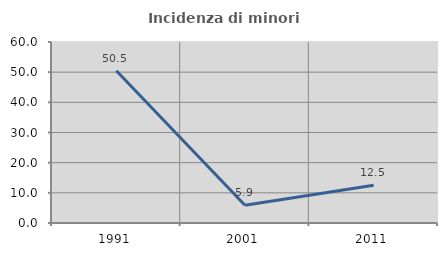
| Category | Incidenza di minori stranieri |
|---|---|
| 1991.0 | 50.476 |
| 2001.0 | 5.882 |
| 2011.0 | 12.5 |